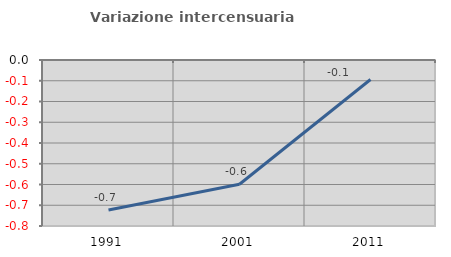
| Category | Variazione intercensuaria annua |
|---|---|
| 1991.0 | -0.723 |
| 2001.0 | -0.599 |
| 2011.0 | -0.094 |